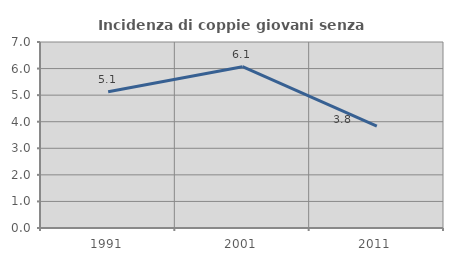
| Category | Incidenza di coppie giovani senza figli |
|---|---|
| 1991.0 | 5.126 |
| 2001.0 | 6.071 |
| 2011.0 | 3.835 |